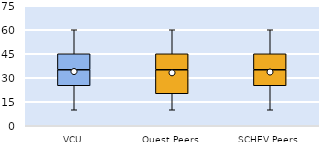
| Category | 25th | 50th | 75th |
|---|---|---|---|
| VCU | 25 | 10 | 10 |
| Quest Peers | 20 | 15 | 10 |
| SCHEV Peers | 25 | 10 | 10 |